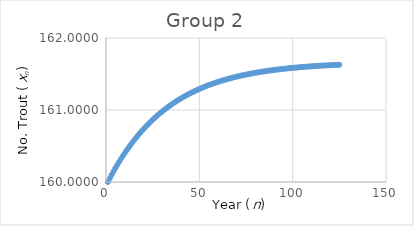
| Category | xn |
|---|---|
| 1.0 | 160 |
| 2.0 | 160.05 |
| 3.0 | 160.098 |
| 4.0 | 160.146 |
| 5.0 | 160.191 |
| 6.0 | 160.235 |
| 7.0 | 160.278 |
| 8.0 | 160.32 |
| 9.0 | 160.36 |
| 10.0 | 160.4 |
| 11.0 | 160.438 |
| 12.0 | 160.474 |
| 13.0 | 160.51 |
| 14.0 | 160.545 |
| 15.0 | 160.579 |
| 16.0 | 160.611 |
| 17.0 | 160.643 |
| 18.0 | 160.674 |
| 19.0 | 160.703 |
| 20.0 | 160.732 |
| 21.0 | 160.76 |
| 22.0 | 160.788 |
| 23.0 | 160.814 |
| 24.0 | 160.839 |
| 25.0 | 160.864 |
| 26.0 | 160.888 |
| 27.0 | 160.912 |
| 28.0 | 160.934 |
| 29.0 | 160.956 |
| 30.0 | 160.978 |
| 31.0 | 160.998 |
| 32.0 | 161.018 |
| 33.0 | 161.038 |
| 34.0 | 161.057 |
| 35.0 | 161.075 |
| 36.0 | 161.093 |
| 37.0 | 161.11 |
| 38.0 | 161.127 |
| 39.0 | 161.143 |
| 40.0 | 161.159 |
| 41.0 | 161.174 |
| 42.0 | 161.189 |
| 43.0 | 161.203 |
| 44.0 | 161.217 |
| 45.0 | 161.23 |
| 46.0 | 161.243 |
| 47.0 | 161.256 |
| 48.0 | 161.268 |
| 49.0 | 161.28 |
| 50.0 | 161.292 |
| 51.0 | 161.303 |
| 52.0 | 161.314 |
| 53.0 | 161.325 |
| 54.0 | 161.335 |
| 55.0 | 161.345 |
| 56.0 | 161.355 |
| 57.0 | 161.364 |
| 58.0 | 161.373 |
| 59.0 | 161.382 |
| 60.0 | 161.39 |
| 61.0 | 161.399 |
| 62.0 | 161.407 |
| 63.0 | 161.414 |
| 64.0 | 161.422 |
| 65.0 | 161.429 |
| 66.0 | 161.437 |
| 67.0 | 161.443 |
| 68.0 | 161.45 |
| 69.0 | 161.457 |
| 70.0 | 161.463 |
| 71.0 | 161.469 |
| 72.0 | 161.475 |
| 73.0 | 161.481 |
| 74.0 | 161.486 |
| 75.0 | 161.492 |
| 76.0 | 161.497 |
| 77.0 | 161.502 |
| 78.0 | 161.507 |
| 79.0 | 161.512 |
| 80.0 | 161.516 |
| 81.0 | 161.521 |
| 82.0 | 161.525 |
| 83.0 | 161.53 |
| 84.0 | 161.534 |
| 85.0 | 161.538 |
| 86.0 | 161.542 |
| 87.0 | 161.545 |
| 88.0 | 161.549 |
| 89.0 | 161.552 |
| 90.0 | 161.556 |
| 91.0 | 161.559 |
| 92.0 | 161.562 |
| 93.0 | 161.566 |
| 94.0 | 161.569 |
| 95.0 | 161.572 |
| 96.0 | 161.574 |
| 97.0 | 161.577 |
| 98.0 | 161.58 |
| 99.0 | 161.582 |
| 100.0 | 161.585 |
| 101.0 | 161.587 |
| 102.0 | 161.59 |
| 103.0 | 161.592 |
| 104.0 | 161.594 |
| 105.0 | 161.597 |
| 106.0 | 161.599 |
| 107.0 | 161.601 |
| 108.0 | 161.603 |
| 109.0 | 161.605 |
| 110.0 | 161.606 |
| 111.0 | 161.608 |
| 112.0 | 161.61 |
| 113.0 | 161.612 |
| 114.0 | 161.613 |
| 115.0 | 161.615 |
| 116.0 | 161.616 |
| 117.0 | 161.618 |
| 118.0 | 161.619 |
| 119.0 | 161.621 |
| 120.0 | 161.622 |
| 121.0 | 161.624 |
| 122.0 | 161.625 |
| 123.0 | 161.626 |
| 124.0 | 161.627 |
| 125.0 | 161.629 |